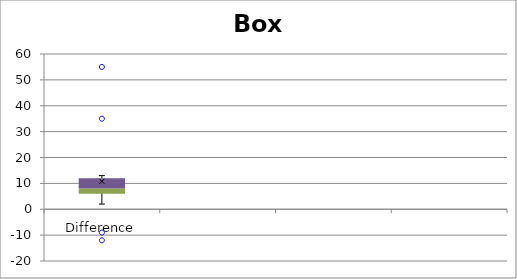
| Category | Min | Q1-Min | Med-Q1 | Q3-Med |
|---|---|---|---|---|
| Difference | 2 | 4 | 2 | 4 |